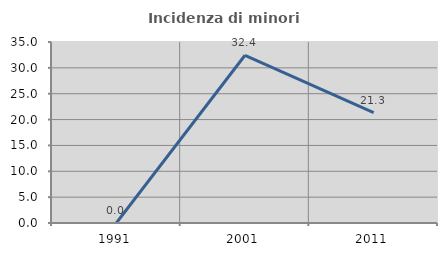
| Category | Incidenza di minori stranieri |
|---|---|
| 1991.0 | 0 |
| 2001.0 | 32.432 |
| 2011.0 | 21.324 |